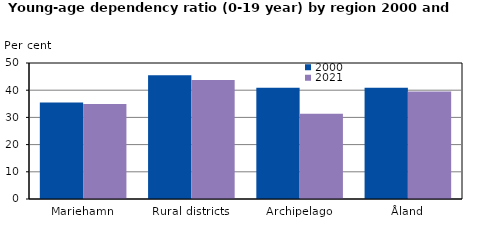
| Category | 2000 | 2021 |
|---|---|---|
| Mariehamn | 35.463 | 34.94 |
| Rural districts | 45.524 | 43.745 |
| Archipelago | 40.92 | 31.352 |
| Åland | 40.872 | 39.537 |